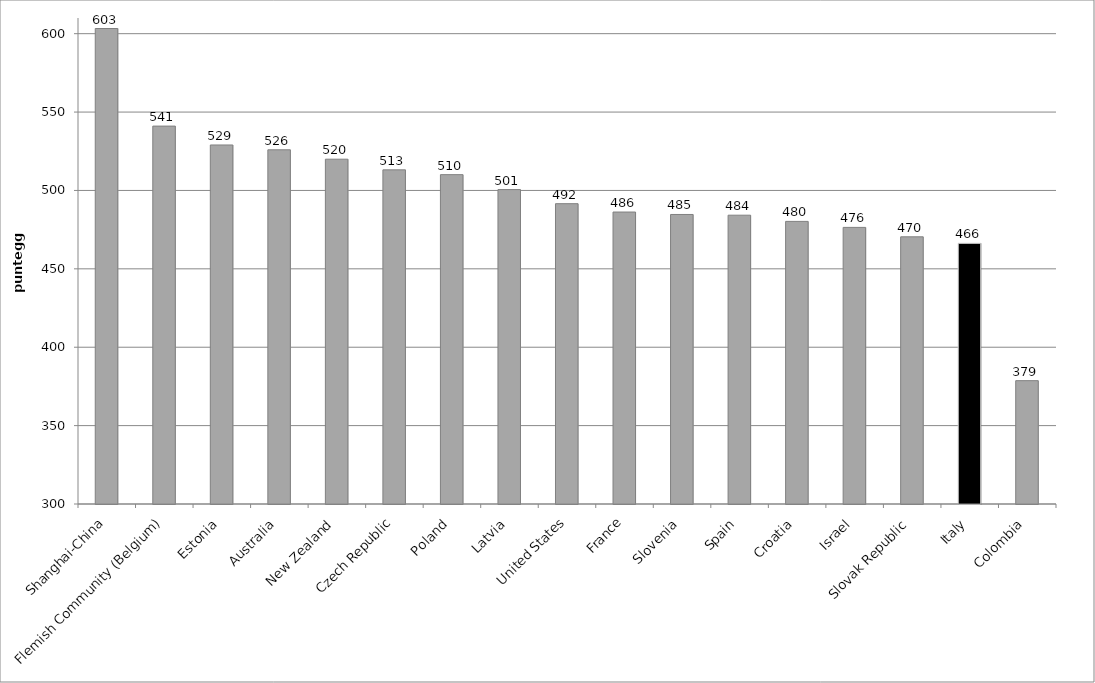
| Category | Series 0 |
|---|---|
| Shanghai-China | 603.298 |
| Flemish Community (Belgium) | 541.044 |
| Estonia | 529.007 |
| Australia | 525.928 |
| New Zealand | 519.934 |
| Czech Republic | 513.138 |
| Poland | 510.08 |
| Latvia | 500.554 |
| United States | 491.566 |
| France | 486.225 |
| Slovenia | 484.677 |
| Spain | 484.219 |
| Croatia | 480.265 |
| Israel | 476.431 |
| Slovak Republic | 470.423 |
| Italy | 466.3 |
| Colombia | 378.67 |